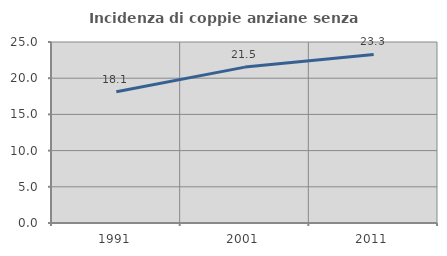
| Category | Incidenza di coppie anziane senza figli  |
|---|---|
| 1991.0 | 18.142 |
| 2001.0 | 21.531 |
| 2011.0 | 23.28 |